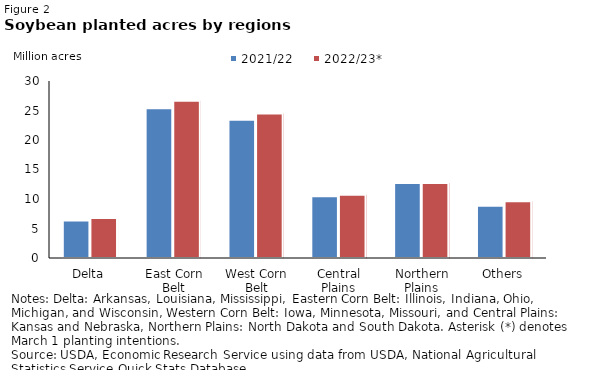
| Category | 2021/22 | 2022/23* |
|---|---|---|
| Delta | 6.34 | 6.8 |
| East Corn Belt | 25.4 | 26.65 |
| West Corn Belt | 23.45 | 24.5 |
| Central Plains | 10.45 | 10.7 |
| Northern Plains | 12.7 | 12.7 |
| Others | 8.855 | 9.605 |